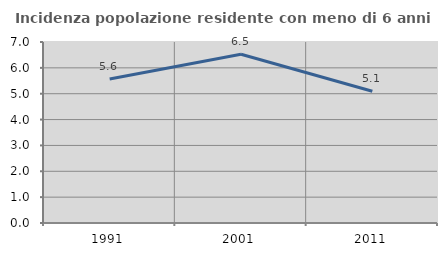
| Category | Incidenza popolazione residente con meno di 6 anni |
|---|---|
| 1991.0 | 5.567 |
| 2001.0 | 6.526 |
| 2011.0 | 5.097 |